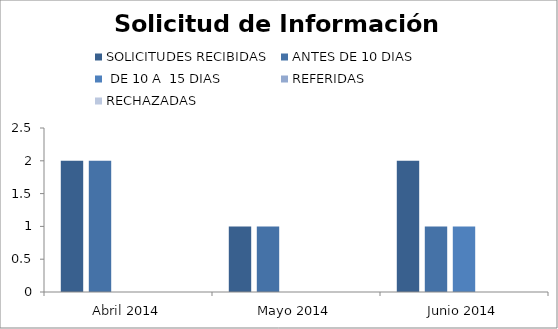
| Category | SOLICITUDES RECIBIDAS | ANTES DE 10 DIAS |  DE 10 A  15 DIAS  | REFERIDAS | RECHAZADAS |
|---|---|---|---|---|---|
| Abril 2014 | 2 | 2 | 0 | 0 | 0 |
| Mayo 2014 | 1 | 1 | 0 | 0 | 0 |
| Junio 2014 | 2 | 1 | 1 | 0 | 0 |